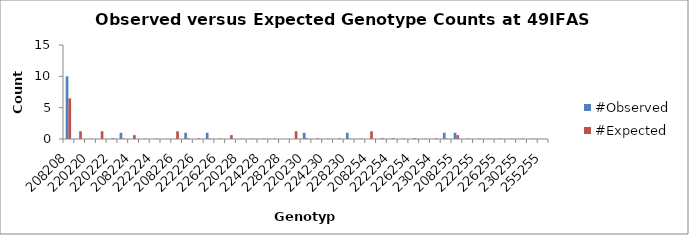
| Category | #Observed | #Expected |
|---|---|---|
| 208208.0 | 10 | 6.485 |
| 208220.0 | 0 | 1.235 |
| 220220.0 | 0 | 0.059 |
| 208222.0 | 0 | 1.235 |
| 220222.0 | 0 | 0.118 |
| 222222.0 | 1 | 0.059 |
| 208224.0 | 0 | 0.618 |
| 220224.0 | 0 | 0.059 |
| 222224.0 | 0 | 0.059 |
| 224224.0 | 0 | 0.015 |
| 208226.0 | 0 | 1.235 |
| 220226.0 | 1 | 0.118 |
| 222226.0 | 0 | 0.118 |
| 224226.0 | 1 | 0.059 |
| 226226.0 | 0 | 0.059 |
| 208228.0 | 0 | 0.618 |
| 220228.0 | 0 | 0.059 |
| 222228.0 | 0 | 0.059 |
| 224228.0 | 0 | 0.029 |
| 226228.0 | 0 | 0.059 |
| 228228.0 | 0 | 0.015 |
| 208230.0 | 0 | 1.235 |
| 220230.0 | 1 | 0.118 |
| 222230.0 | 0 | 0.118 |
| 224230.0 | 0 | 0.059 |
| 226230.0 | 0 | 0.118 |
| 228230.0 | 1 | 0.059 |
| 230230.0 | 0 | 0.059 |
| 208254.0 | 0 | 1.235 |
| 220254.0 | 0 | 0.118 |
| 222254.0 | 0 | 0.118 |
| 224254.0 | 0 | 0.059 |
| 226254.0 | 0 | 0.118 |
| 228254.0 | 0 | 0.059 |
| 230254.0 | 0 | 0.118 |
| 254254.0 | 1 | 0.059 |
| 208255.0 | 1 | 0.618 |
| 220255.0 | 0 | 0.059 |
| 222255.0 | 0 | 0.059 |
| 224255.0 | 0 | 0.029 |
| 226255.0 | 0 | 0.059 |
| 228255.0 | 0 | 0.029 |
| 230255.0 | 0 | 0.059 |
| 254255.0 | 0 | 0.059 |
| 255255.0 | 0 | 0.015 |